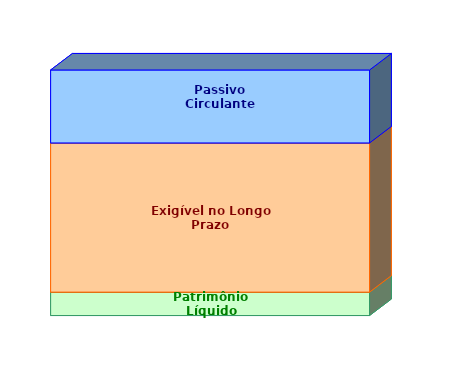
| Category | Patrimônio Líquido | Exigível no Longo Prazo | Passivo Circulante |
|---|---|---|---|
| 0 | 0.095 | 0.607 | 0.297 |